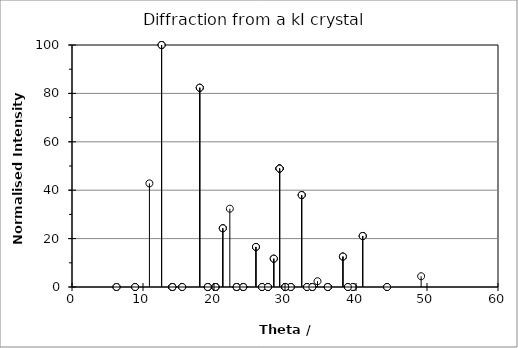
| Category | Series 0 |
|---|---|
| 0.0 | 0 |
| 6.270345775666384 | 0 |
| 12.61740654438952 | 100 |
| 19.126782602013723 | 0 |
| 25.904945520493982 | 16.556 |
| 6.270345775666384 | 0 |
| 8.885491246067124 | 0 |
| 14.135921719071801 | 0 |
| 20.20520885219723 | 0 |
| 26.7645382676546 | 0 |
| 12.61740654438952 | 100 |
| 14.135921719071801 | 0 |
| 17.994181395327086 | 82.343 |
| 23.19101692888938 | 0 |
| 29.238496334516107 | 48.933 |
| 19.126782602013723 | 0 |
| 20.20520885219723 | 0 |
| 23.19101692888938 | 0 |
| 27.605468423952722 | 0 |
| 33.09981736949052 | 0 |
| 25.904945520493982 | 16.556 |
| 26.7645382676546 | 0 |
| 29.238496334516107 | 48.933 |
| 33.09981736949052 | 0 |
| 38.15863049377275 | 12.574 |
| 6.270345775666384 | 0 |
| 8.885491246067124 | 0 |
| 14.135921719071801 | 0 |
| 20.20520885219723 | 0 |
| 26.7645382676546 | 0 |
| 8.885491246067124 | 0 |
| 10.904603760214648 | 42.819 |
| 15.517513942939846 | 0 |
| 21.237905218158275 | 24.266 |
| 27.605468423952722 | 0 |
| 14.135921719071801 | 0 |
| 15.517513942939846 | 0 |
| 19.126782602013723 | 0 |
| 24.120892331145466 | 0 |
| 30.033632400981276 | 0 |
| 20.20520885219723 | 0 |
| 21.237905218158275 | 24.266 |
| 24.120892331145466 | 0 |
| 28.429582860855238 | 11.704 |
| 33.84266076413807 | 0 |
| 26.7645382676546 | 0 |
| 27.605468423952722 | 0 |
| 30.033632400981276 | 0 |
| 33.84266076413807 | 0 |
| 38.86005363827161 | 0 |
| 12.61740654438952 | 100 |
| 14.135921719071801 | 0 |
| 17.994181395327086 | 82.343 |
| 23.19101692888938 | 0 |
| 29.238496334516107 | 48.933 |
| 14.135921719071801 | 0 |
| 15.517513942939846 | 0 |
| 19.126782602013723 | 0 |
| 24.120892331145466 | 0 |
| 30.033632400981276 | 0 |
| 17.994181395327086 | 82.343 |
| 19.126782602013723 | 0 |
| 22.231433981454845 | 32.355 |
| 26.7645382676546 | 0 |
| 32.34837693631572 | 38.006 |
| 23.19101692888938 | 0 |
| 24.120892331145466 | 0 |
| 26.7645382676546 | 0 |
| 30.81625566638014 | 0 |
| 36.02703606689308 | 0 |
| 29.238496334516107 | 48.933 |
| 30.033632400981276 | 0 |
| 32.34837693631572 | 38.006 |
| 36.02703606689308 | 0 |
| 40.943853948104696 | 21.087 |
| 19.126782602013723 | 0 |
| 20.20520885219723 | 0 |
| 23.19101692888938 | 0 |
| 27.605468423952722 | 0 |
| 33.09981736949052 | 0 |
| 20.20520885219723 | 0 |
| 21.237905218158275 | 24.266 |
| 24.120892331145466 | 0 |
| 28.4 | 11.704 |
| 33.84266076413807 | 0 |
| 23.19101692888938 | 0 |
| 24.120892331145466 | 0 |
| 26.7645382676546 | 0 |
| 30.81625566638014 | 0 |
| 36.02703606689308 | 0 |
| 27.605468423952722 | 0 |
| 28.429582860855238 | 11.704 |
| 30.81625566638014 | 0 |
| 34.5776791320537 | 2.391 |
| 39.55775743728876 | 0 |
| 33.09981736949052 | 0 |
| 33.84266076413807 | 0 |
| 36.02703606689308 | 0 |
| 39.55775743728876 | 0 |
| 44.37474305651478 | 0 |
| 25.904945520493982 | 16.556 |
| 26.7645382676546 | 0 |
| 29.238496334516107 | 48.933 |
| 33.09981736949052 | 0 |
| 38.15863049377275 | 12.574 |
| 26.7645382676546 | 0 |
| 27.605468423952722 | 0 |
| 30.033632400981276 | 0 |
| 33.84266076413807 | 0 |
| 38.86005363827161 | 0 |
| 29.238496334516107 | 48.933 |
| 30.033632400981276 | 0 |
| 32.34837693631572 | 38.006 |
| 36.02703606689308 | 0 |
| 40.943853948104696 | 21.087 |
| 33.09981736949052 | 0 |
| 33.84266076413807 | 0 |
| 36.02703606689308 | 0 |
| 39.55775743728876 | 0 |
| 44.37474305651478 | 0 |
| 38.15863049377275 | 12.574 |
| 38.86005363827161 | 0 |
| 40.943853948104696 | 21.087 |
| 44.37474305651478 | 0 |
| 49.17390440518523 | 4.447 |